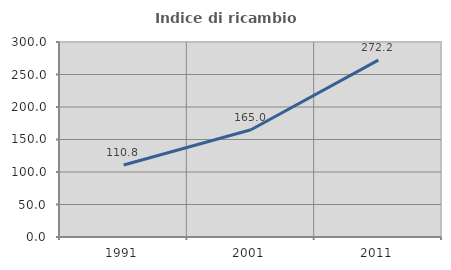
| Category | Indice di ricambio occupazionale  |
|---|---|
| 1991.0 | 110.777 |
| 2001.0 | 164.986 |
| 2011.0 | 272.204 |